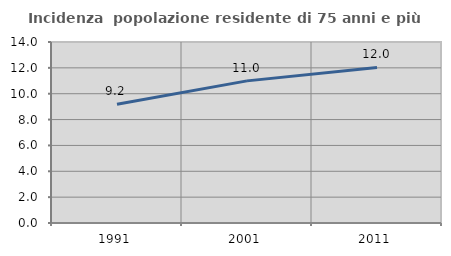
| Category | Incidenza  popolazione residente di 75 anni e più |
|---|---|
| 1991.0 | 9.179 |
| 2001.0 | 10.993 |
| 2011.0 | 12.03 |